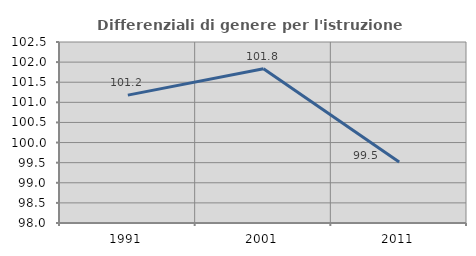
| Category | Differenziali di genere per l'istruzione superiore |
|---|---|
| 1991.0 | 101.179 |
| 2001.0 | 101.835 |
| 2011.0 | 99.516 |